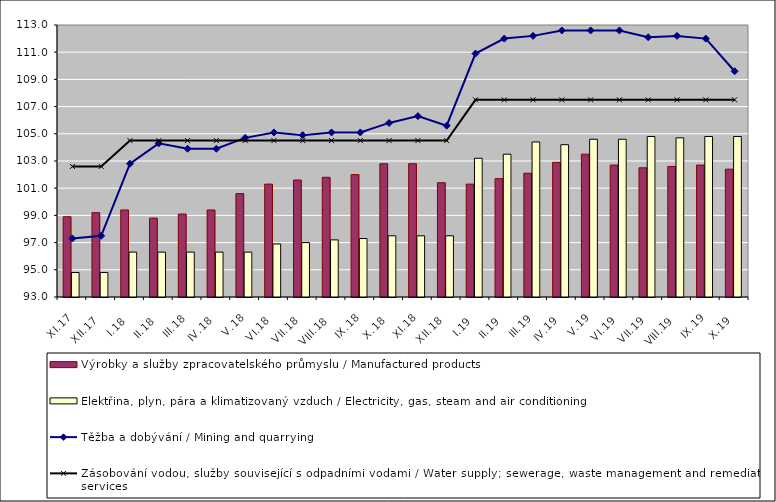
| Category | Výrobky a služby zpracovatelského průmyslu / Manufactured products | Elektřina, plyn, pára a klimatizovaný vzduch / Electricity, gas, steam and air conditioning |
|---|---|---|
| XI.17 | 98.9 | 94.8 |
| XII.17 | 99.2 | 94.8 |
| I.18 | 99.4 | 96.3 |
| II.18 | 98.8 | 96.3 |
| III.18 | 99.1 | 96.3 |
| IV.18 | 99.4 | 96.3 |
| V.18 | 100.6 | 96.3 |
| VI.18 | 101.3 | 96.9 |
| VII.18 | 101.6 | 97 |
| VIII.18 | 101.8 | 97.2 |
| IX.18 | 102 | 97.3 |
| X.18 | 102.8 | 97.5 |
| XI.18 | 102.8 | 97.5 |
| XII.18 | 101.4 | 97.5 |
| I.19 | 101.3 | 103.2 |
| II.19 | 101.7 | 103.5 |
| III.19 | 102.1 | 104.4 |
| IV.19 | 102.9 | 104.2 |
| V.19 | 103.5 | 104.6 |
| VI.19 | 102.7 | 104.6 |
| VII.19 | 102.5 | 104.8 |
| VIII.19 | 102.6 | 104.7 |
| IX.19 | 102.7 | 104.8 |
| X.19 | 102.4 | 104.8 |